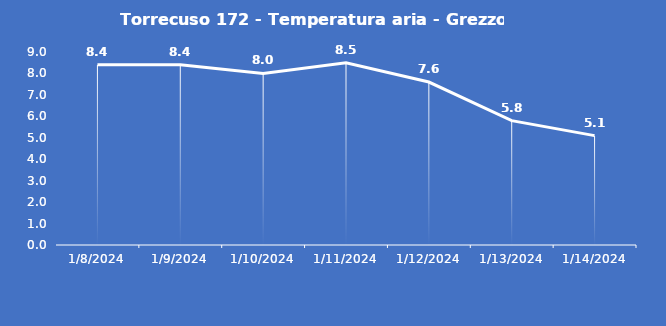
| Category | Torrecuso 172 - Temperatura aria - Grezzo (°C) |
|---|---|
| 1/8/24 | 8.4 |
| 1/9/24 | 8.4 |
| 1/10/24 | 8 |
| 1/11/24 | 8.5 |
| 1/12/24 | 7.6 |
| 1/13/24 | 5.8 |
| 1/14/24 | 5.1 |